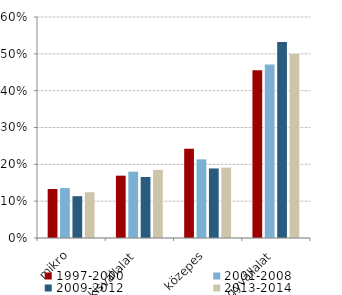
| Category | 1997-2000 | 2001-2008 | 2009-2012 | 2013-2014 |
|---|---|---|---|---|
| mikro | 0.133 | 0.135 | 0.114 | 0.124 |
| kisvállalat | 0.169 | 0.18 | 0.166 | 0.185 |
| közepes | 0.242 | 0.214 | 0.189 | 0.191 |
| nagyvállalat | 0.455 | 0.471 | 0.532 | 0.5 |